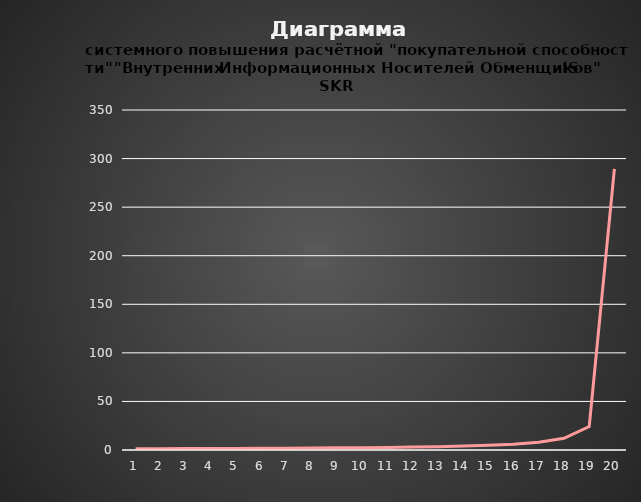
| Category | Series 0 |
|---|---|
| 0 | 1.27 |
| 1 | 1.34 |
| 2 | 1.419 |
| 3 | 1.508 |
| 4 | 1.608 |
| 5 | 1.723 |
| 6 | 1.855 |
| 7 | 2.01 |
| 8 | 2.193 |
| 9 | 2.412 |
| 10 | 2.68 |
| 11 | 3.015 |
| 12 | 3.446 |
| 13 | 4.02 |
| 14 | 4.824 |
| 15 | 6.03 |
| 16 | 8.04 |
| 17 | 12.06 |
| 18 | 24.12 |
| 19 | 289.446 |